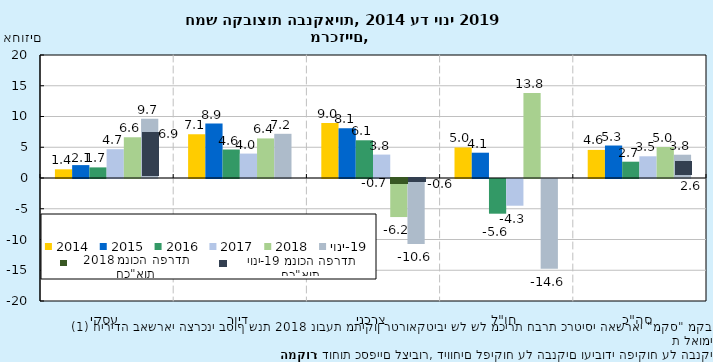
| Category | 2014 | 2015 | 2016 | 2017 | 2018 | יוני-19 |
|---|---|---|---|---|---|---|
| עסקי | 1.412 | 2.097 | 1.725 | 4.682 | 6.625 | 9.654 |
| דיור | 7.113 | 8.856 | 4.633 | 3.969 | 6.436 | 7.186 |
| צרכני | 8.961 | 8.09 | 6.134 | 3.807 | -6.187 | -10.559 |
| חו"ל | 4.964 | 4.113 | -5.642 | -4.345 | 13.841 | -14.609 |
| סה"כ | 4.568 | 5.282 | 2.651 | 3.53 | 5.038 | 3.786 |